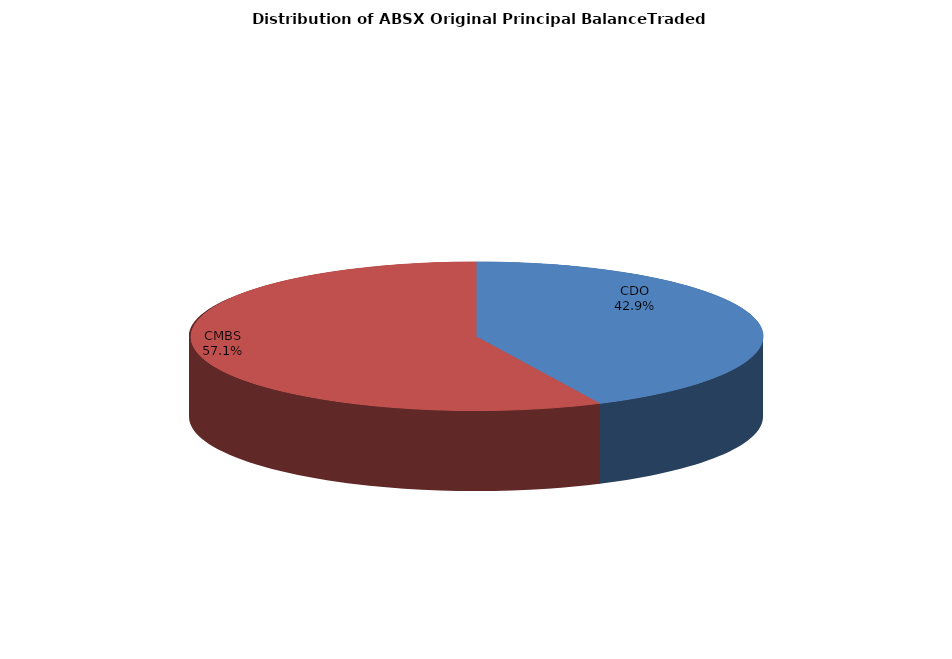
| Category | Series 0 |
|---|---|
| CDO | 1449992909.34 |
| CMBS | 1929972902.561 |